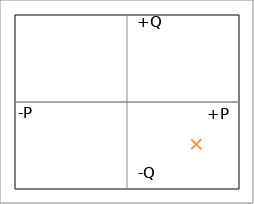
| Category | Complex Power S |
|---|---|
| 3092.32932485377 | -2428.816 |